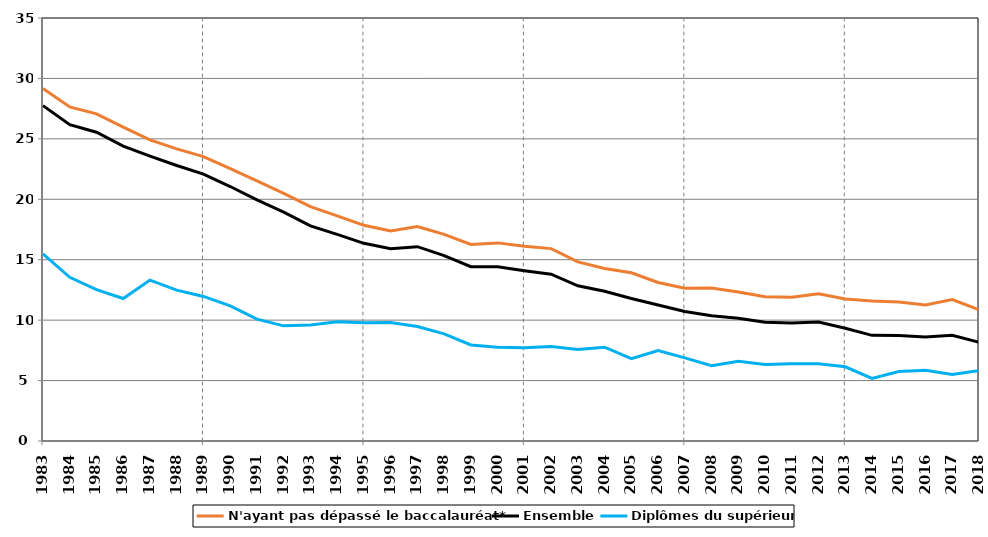
| Category | N'ayant pas dépassé le baccalauréat* | Ensemble | Diplômes du supérieur |
|---|---|---|---|
| 1983.0 | 29.16 | 27.748 | 15.485 |
| 1984.0 | 27.646 | 26.172 | 13.542 |
| 1985.0 | 27.071 | 25.548 | 12.53 |
| 1986.0 | 25.966 | 24.396 | 11.793 |
| 1987.0 | 24.913 | 23.577 | 13.31 |
| 1988.0 | 24.172 | 22.793 | 12.483 |
| 1989.0 | 23.527 | 22.081 | 11.961 |
| 1990.0 | 22.529 | 21.056 | 11.182 |
| 1991.0 | 21.516 | 19.95 | 10.084 |
| 1992.0 | 20.493 | 18.932 | 9.528 |
| 1993.0 | 19.398 | 17.802 | 9.602 |
| 1994.0 | 18.63 | 17.1 | 9.873 |
| 1995.0 | 17.848 | 16.357 | 9.792 |
| 1996.0 | 17.38 | 15.908 | 9.796 |
| 1997.0 | 17.741 | 16.079 | 9.479 |
| 1998.0 | 17.1 | 15.339 | 8.86 |
| 1999.0 | 16.261 | 14.427 | 7.951 |
| 2000.0 | 16.393 | 14.411 | 7.759 |
| 2001.0 | 16.11 | 14.093 | 7.721 |
| 2002.0 | 15.917 | 13.801 | 7.812 |
| 2003.0 | 14.817 | 12.841 | 7.577 |
| 2004.0 | 14.271 | 12.388 | 7.761 |
| 2005.0 | 13.919 | 11.792 | 6.808 |
| 2006.0 | 13.113 | 11.256 | 7.484 |
| 2007.0 | 12.649 | 10.721 | 6.875 |
| 2008.0 | 12.656 | 10.358 | 6.232 |
| 2009.0 | 12.328 | 10.148 | 6.598 |
| 2010.0 | 11.933 | 9.817 | 6.329 |
| 2011.0 | 11.9 | 9.763 | 6.4 |
| 2012.0 | 12.188 | 9.841 | 6.382 |
| 2013.0 | 11.749 | 9.332 | 6.141 |
| 2014.0 | 11.583 | 8.74 | 5.18 |
| 2015.0 | 11.494 | 8.733 | 5.75 |
| 2016.0 | 11.251 | 8.613 | 5.855 |
| 2017.0 | 11.696 | 8.746 | 5.508 |
| 2018.0 | 10.868 | 8.174 | 5.826 |